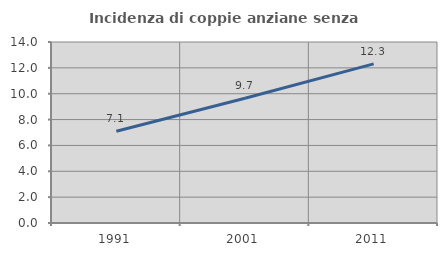
| Category | Incidenza di coppie anziane senza figli  |
|---|---|
| 1991.0 | 7.095 |
| 2001.0 | 9.651 |
| 2011.0 | 12.305 |